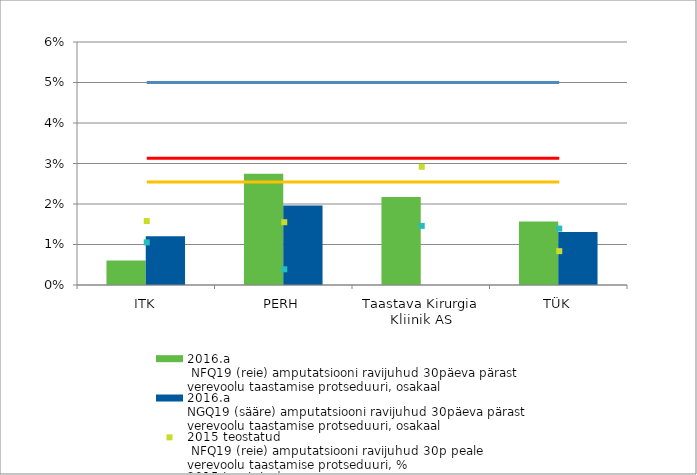
| Category | 2016.a
 NFQ19 (reie) amputatsiooni ravijuhud 30päeva pärast
verevoolu taastamise protseduuri, osakaal | 2016.a
NGQ19 (sääre) amputatsiooni ravijuhud 30päeva pärast
verevoolu taastamise protseduuri, osakaal |
|---|---|---|
| ITK | 0.006 | 0.012 |
| PERH | 0.027 | 0.02 |
| Taastava Kirurgia Kliinik AS | 0.022 | 0 |
| TÜK | 0.016 | 0.013 |